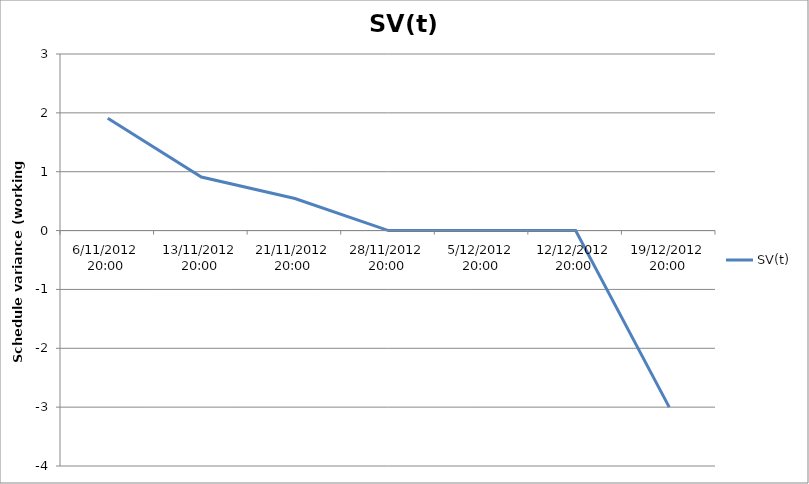
| Category | SV(t) |
|---|---|
| 6/11/2012 20:00 | 1.909 |
| 13/11/2012 20:00 | 0.909 |
| 21/11/2012 20:00 | 0.545 |
| 28/11/2012 20:00 | 0 |
| 5/12/2012 20:00 | 0 |
| 12/12/2012 20:00 | 0 |
| 19/12/2012 20:00 | -3 |